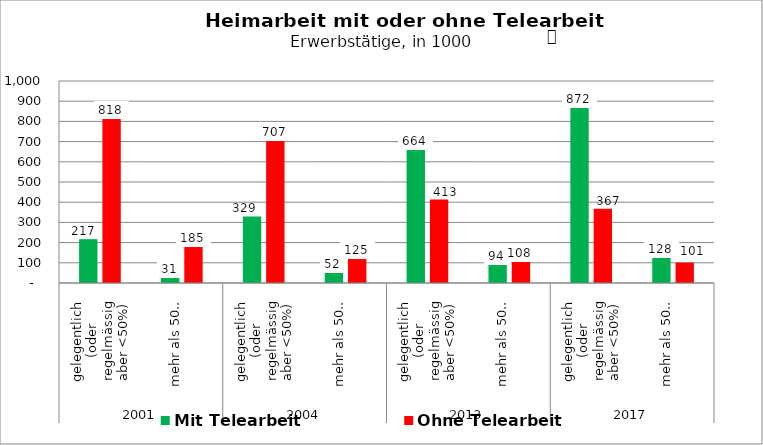
| Category | Mit Telearbeit | Ohne Telearbeit |
|---|---|---|
| 0 | 217 | 818 |
| 1 | 31 | 185 |
| 2 | 329 | 707 |
| 3 | 52 | 125 |
| 4 | 664 | 413 |
| 5 | 94 | 108 |
| 6 | 872 | 367 |
| 7 | 128 | 101 |